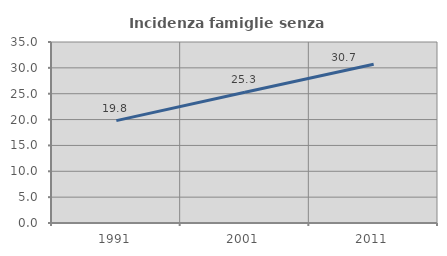
| Category | Incidenza famiglie senza nuclei |
|---|---|
| 1991.0 | 19.793 |
| 2001.0 | 25.266 |
| 2011.0 | 30.691 |